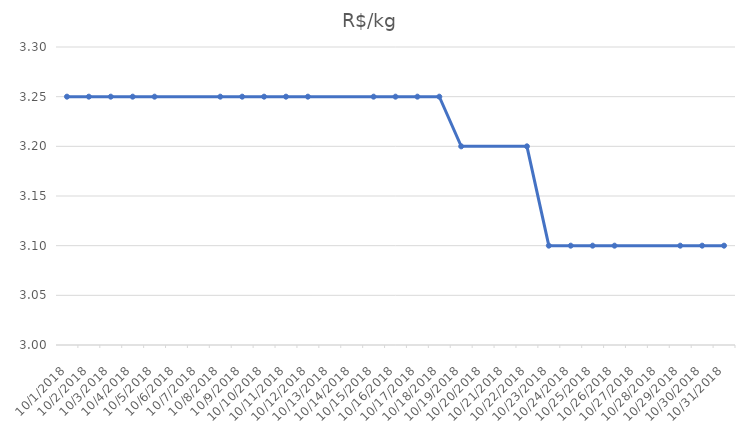
| Category | R$/kg |
|---|---|
| 10/1/18 | 3.25 |
| 10/2/18 | 3.25 |
| 10/3/18 | 3.25 |
| 10/4/18 | 3.25 |
| 10/5/18 | 3.25 |
| 10/8/18 | 3.25 |
| 10/9/18 | 3.25 |
| 10/10/18 | 3.25 |
| 10/11/18 | 3.25 |
| 10/12/18 | 3.25 |
| 10/15/18 | 3.25 |
| 10/16/18 | 3.25 |
| 10/17/18 | 3.25 |
| 10/18/18 | 3.25 |
| 10/19/18 | 3.2 |
| 10/22/18 | 3.2 |
| 10/23/18 | 3.1 |
| 10/24/18 | 3.1 |
| 10/25/18 | 3.1 |
| 10/26/18 | 3.1 |
| 10/29/18 | 3.1 |
| 10/30/18 | 3.1 |
| 10/31/18 | 3.1 |